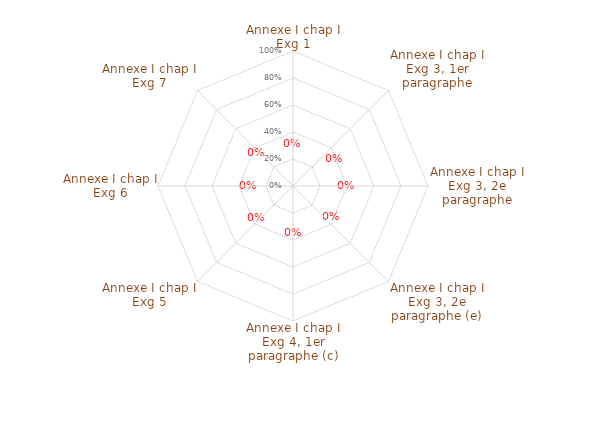
| Category | annexe1 chap1 |
|---|---|
| Annexe I chap I Exg 1 | 0 |
| Annexe I chap I Exg 3, 1er paragraphe | 0 |
| Annexe I chap I Exg 3, 2e paragraphe | 0 |
| Annexe I chap I Exg 3, 2e paragraphe (e) | 0 |
| Annexe I chap I Exg 4, 1er paragraphe (c) | 0 |
| Annexe I chap I Exg 5 | 0 |
| Annexe I chap I Exg 6 | 0 |
| Annexe I chap I Exg 7 | 0 |